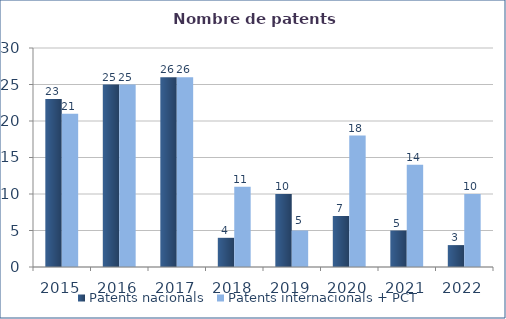
| Category | Patents nacionals | Patents internacionals + PCT |
|---|---|---|
| 2015.0 | 23 | 21 |
| 2016.0 | 25 | 25 |
| 2017.0 | 26 | 26 |
| 2018.0 | 4 | 11 |
| 2019.0 | 10 | 5 |
| 2020.0 | 7 | 18 |
| 2021.0 | 5 | 14 |
| 2022.0 | 3 | 10 |